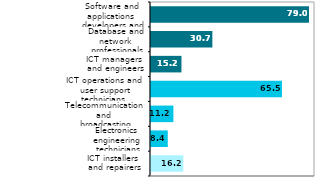
| Category | Series 0 |
|---|---|
| ICT installers 
 and repairers  | 16.159 |
| Electronics engineering
 technicians | 8.388 |
| Telecommunication and
 broadcasting technicians | 11.198 |
| ICT operations and
 user support technicians | 65.484 |
| ICT managers
 and engineers | 15.228 |
| Database and network
 professionals | 30.681 |
| Software and applications
 developers and analysts  | 78.991 |